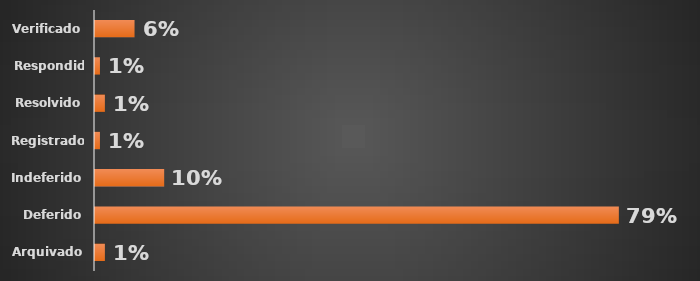
| Category | Total |
|---|---|
| Arquivado | 0.015 |
| Deferido | 0.791 |
| Indeferido | 0.104 |
| Registrado | 0.007 |
| Resolvido | 0.015 |
| Respondido | 0.007 |
| Verificado | 0.06 |